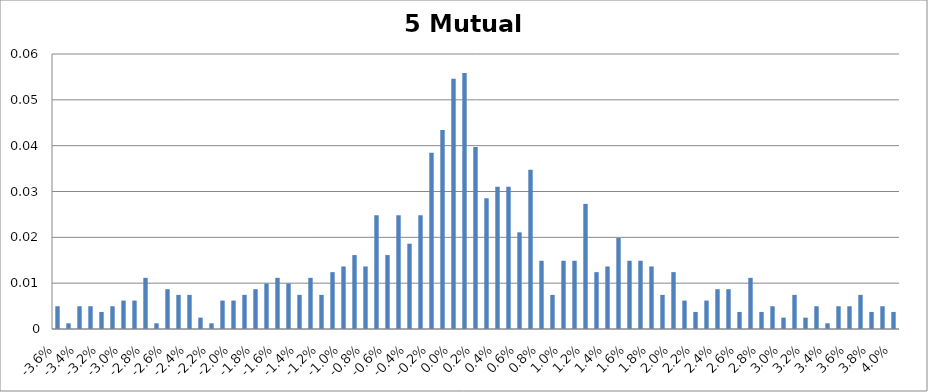
| Category | Series 0 |
|---|---|
| -0.036 | 0.005 |
| -0.035 | 0.001 |
| -0.034 | 0.005 |
| -0.033 | 0.005 |
| -0.032 | 0.004 |
| -0.031 | 0.005 |
| -0.03 | 0.006 |
| -0.029 | 0.006 |
| -0.028 | 0.011 |
| -0.027 | 0.001 |
| -0.026 | 0.009 |
| -0.025 | 0.007 |
| -0.024 | 0.007 |
| -0.023 | 0.002 |
| -0.022 | 0.001 |
| -0.021 | 0.006 |
| -0.02 | 0.006 |
| -0.019 | 0.007 |
| -0.018 | 0.009 |
| -0.017 | 0.01 |
| -0.016 | 0.011 |
| -0.015 | 0.01 |
| -0.014 | 0.007 |
| -0.013 | 0.011 |
| -0.012 | 0.007 |
| -0.011 | 0.012 |
| -0.01 | 0.014 |
| -0.009 | 0.016 |
| -0.008 | 0.014 |
| -0.007 | 0.025 |
| -0.006 | 0.016 |
| -0.005 | 0.025 |
| -0.004 | 0.019 |
| -0.003 | 0.025 |
| -0.002 | 0.038 |
| -0.001 | 0.043 |
| 0.0 | 0.055 |
| 0.001 | 0.056 |
| 0.002 | 0.04 |
| 0.003 | 0.029 |
| 0.004 | 0.031 |
| 0.005 | 0.031 |
| 0.006 | 0.021 |
| 0.007 | 0.035 |
| 0.008 | 0.015 |
| 0.009 | 0.007 |
| 0.01 | 0.015 |
| 0.011 | 0.015 |
| 0.012 | 0.027 |
| 0.013 | 0.012 |
| 0.014 | 0.014 |
| 0.015 | 0.02 |
| 0.016 | 0.015 |
| 0.017 | 0.015 |
| 0.018 | 0.014 |
| 0.019 | 0.007 |
| 0.02 | 0.012 |
| 0.021 | 0.006 |
| 0.022 | 0.004 |
| 0.023 | 0.006 |
| 0.024 | 0.009 |
| 0.025 | 0.009 |
| 0.026 | 0.004 |
| 0.027 | 0.011 |
| 0.028 | 0.004 |
| 0.029 | 0.005 |
| 0.03 | 0.002 |
| 0.031 | 0.007 |
| 0.032 | 0.002 |
| 0.033 | 0.005 |
| 0.034 | 0.001 |
| 0.035 | 0.005 |
| 0.036 | 0.005 |
| 0.037 | 0.007 |
| 0.038 | 0.004 |
| 0.039 | 0.005 |
| 0.04 | 0.004 |